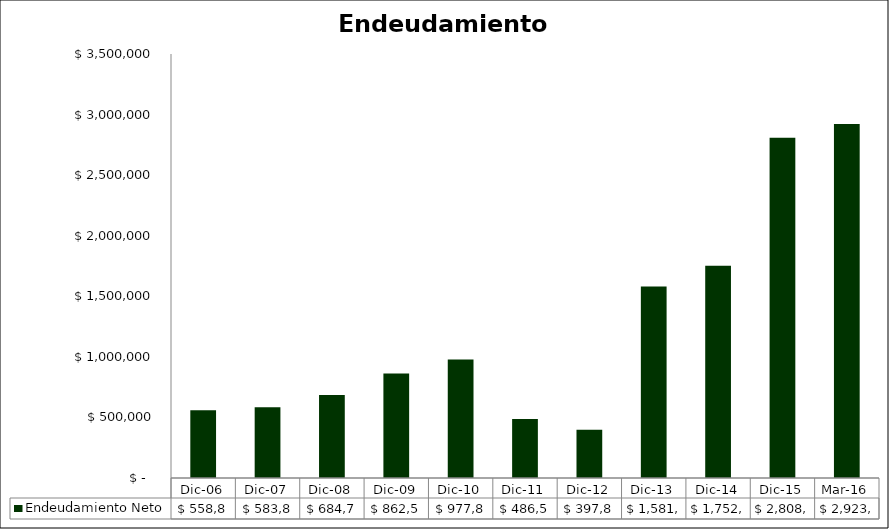
| Category | Endeudamiento Neto  |
|---|---|
| Dic-06 | 558856 |
| Dic-07 | 583844 |
| Dic-08 | 684783 |
| Dic-09 | 862585 |
| Dic-10 | 977827.862 |
| Dic-11 | 486511.217 |
| Dic-12 | 397862.444 |
| Dic-13 | 1581259.56 |
| Dic-14 | 1752414 |
| Dic-15 | 2808200.343 |
| Mar-16 | 2923105.907 |